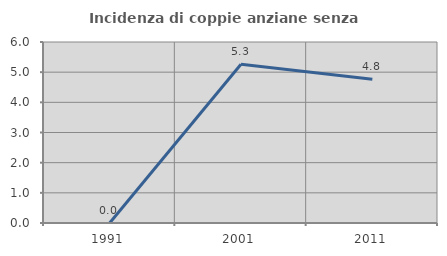
| Category | Incidenza di coppie anziane senza figli  |
|---|---|
| 1991.0 | 0 |
| 2001.0 | 5.263 |
| 2011.0 | 4.762 |